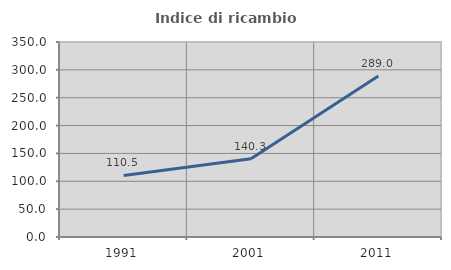
| Category | Indice di ricambio occupazionale  |
|---|---|
| 1991.0 | 110.548 |
| 2001.0 | 140.26 |
| 2011.0 | 288.991 |